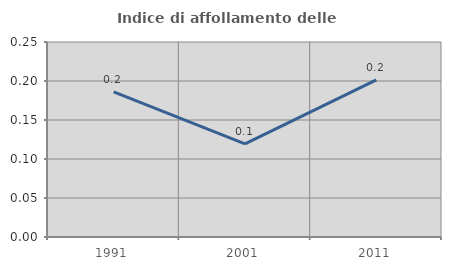
| Category | Indice di affollamento delle abitazioni  |
|---|---|
| 1991.0 | 0.186 |
| 2001.0 | 0.119 |
| 2011.0 | 0.201 |